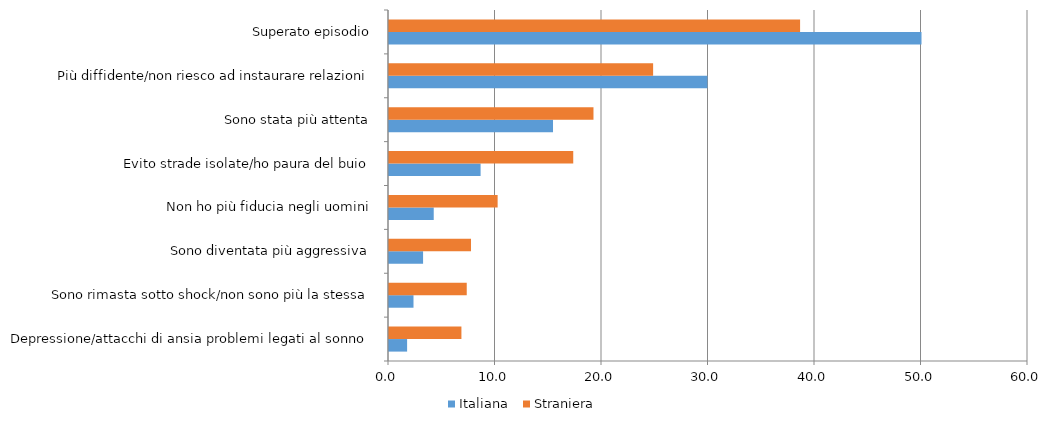
| Category | Italiana  | Straniera |
|---|---|---|
| Depressione/attacchi di ansia problemi legati al sonno | 1.7 | 6.8 |
| Sono rimasta sotto shock/non sono più la stessa | 2.3 | 7.3 |
| Sono diventata più aggressiva | 3.2 | 7.7 |
| Non ho più fiducia negli uomini | 4.2 | 10.2 |
| Evito strade isolate/ho paura del buio | 8.6 | 17.3 |
| Sono stata più attenta | 15.4 | 19.2 |
| Più diffidente/non riesco ad instaurare relazioni | 29.9 | 24.8 |
| Superato episodio | 50 | 38.6 |